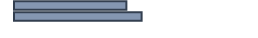
| Category | Percentatge |
|---|---|
| 0 | 46.826 |
| 1 | 53.174 |